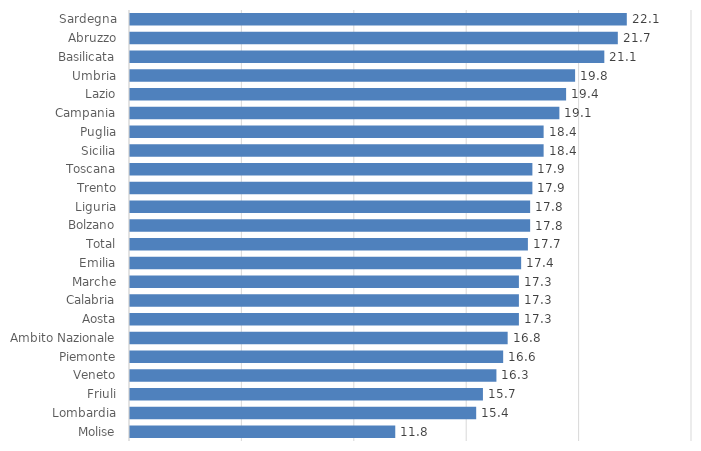
| Category | Series 0 |
|---|---|
| Sardegna | 22.1 |
| Abruzzo | 21.7 |
| Basilicata | 21.1 |
| Umbria | 19.8 |
| Lazio | 19.4 |
| Campania | 19.1 |
| Puglia | 18.4 |
| Sicilia | 18.4 |
| Toscana | 17.9 |
| Trento | 17.9 |
| Liguria | 17.8 |
| Bolzano | 17.8 |
| Total | 17.7 |
| Emilia | 17.4 |
| Marche | 17.3 |
| Calabria | 17.3 |
| Aosta | 17.3 |
| Ambito Nazionale | 16.8 |
| Piemonte | 16.6 |
| Veneto | 16.3 |
| Friuli | 15.7 |
| Lombardia | 15.4 |
| Molise | 11.8 |